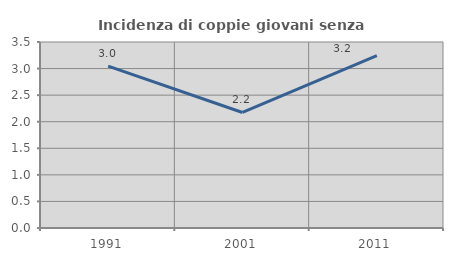
| Category | Incidenza di coppie giovani senza figli |
|---|---|
| 1991.0 | 3.047 |
| 2001.0 | 2.174 |
| 2011.0 | 3.242 |